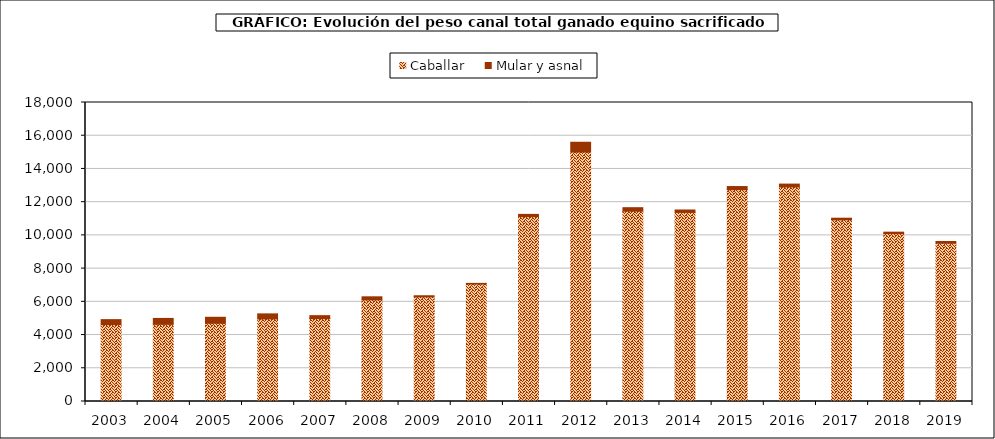
| Category | Caballar | Mular y asnal |
|---|---|---|
| 2003.0 | 4630.2 | 298.1 |
| 2004.0 | 4647.862 | 353.35 |
| 2005.0 | 4710.606 | 359.156 |
| 2006.0 | 4973.651 | 301.565 |
| 2007.0 | 4990.288 | 177.685 |
| 2008.0 | 6117.007 | 185.894 |
| 2009.0 | 6294.766 | 70.94 |
| 2010.0 | 7071.719 | 39.187 |
| 2011.0 | 11131.436 | 133.748 |
| 2012.0 | 15015.542 | 590.926 |
| 2013.0 | 11460.028 | 207.903 |
| 2014.0 | 11383.677 | 145.218 |
| 2015.0 | 12751.613 | 188.71 |
| 2016.0 | 12918.364 | 169.795 |
| 2017.0 | 10935.175 | 99.182 |
| 2018.0 | 10105.017 | 88.917 |
| 2019.0 | 9527.182 | 104.573 |